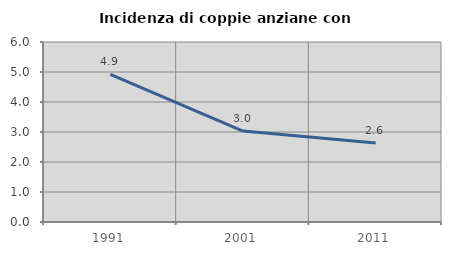
| Category | Incidenza di coppie anziane con figli |
|---|---|
| 1991.0 | 4.918 |
| 2001.0 | 3.03 |
| 2011.0 | 2.632 |